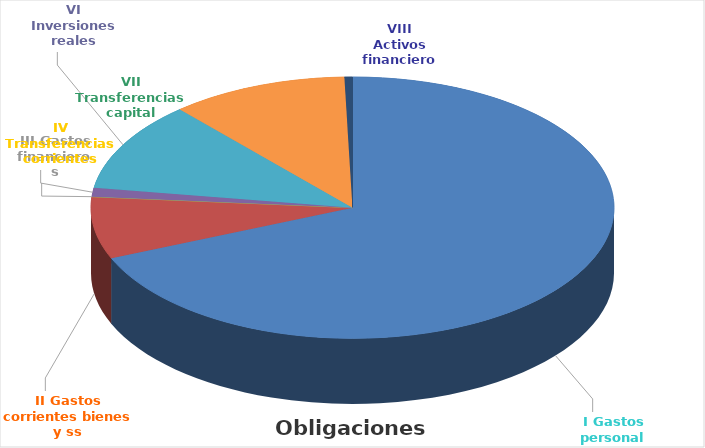
| Category | Obligaciones reconocidas |
|---|---|
| I Gastos personal | 15098223.52 |
| II Gastos corrientes bienes y ss | 1688941.96 |
| III Gastos financieros | 353.07 |
| IV Transferencias corrientes | 237530.68 |
| VI Inversiones reales | 2441733.28 |
| VII Transferencias capital | 2414691.62 |
| VIII Activos financieros | 109000 |